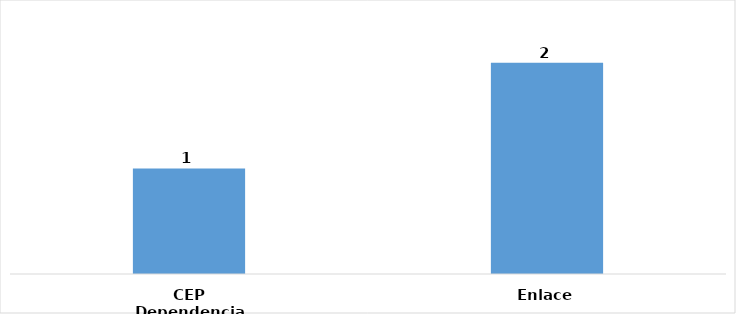
| Category | Total |
|---|---|
| CEP Dependencia | 1 |
| Enlace | 2 |